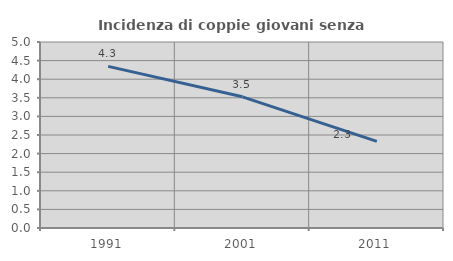
| Category | Incidenza di coppie giovani senza figli |
|---|---|
| 1991.0 | 4.345 |
| 2001.0 | 3.526 |
| 2011.0 | 2.328 |